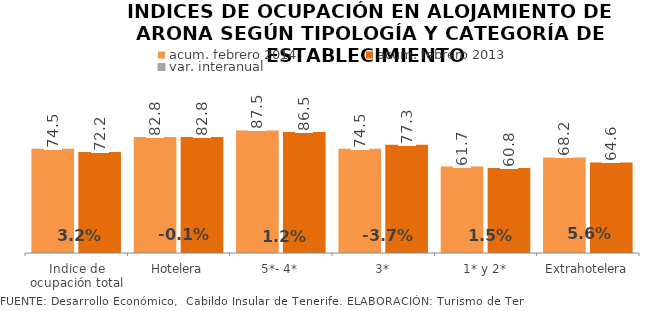
| Category | acum. febrero 2014 | acum. febrero 2013 |
|---|---|---|
| Indice de ocupación total | 74.479 | 72.171 |
| Hotelera | 82.776 | 82.838 |
| 5*- 4* | 87.519 | 86.485 |
| 3* | 74.479 | 77.334 |
| 1* y 2* | 61.697 | 60.77 |
| Extrahotelera | 68.242 | 64.648 |